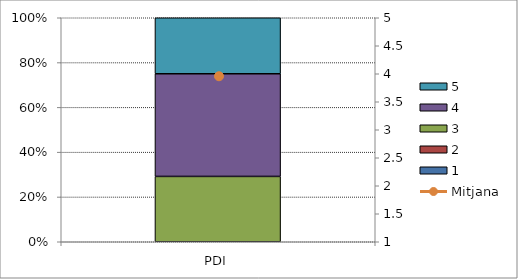
| Category | 1 | 2 | 3 | 4 | 5 |
|---|---|---|---|---|---|
| PDI | 0 | 0 | 7 | 11 | 6 |